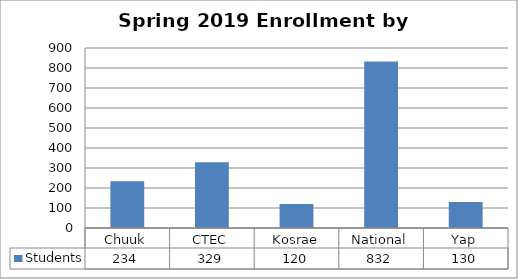
| Category | Students |
|---|---|
| Chuuk | 234 |
| CTEC | 329 |
| Kosrae | 120 |
| National | 832 |
| Yap | 130 |